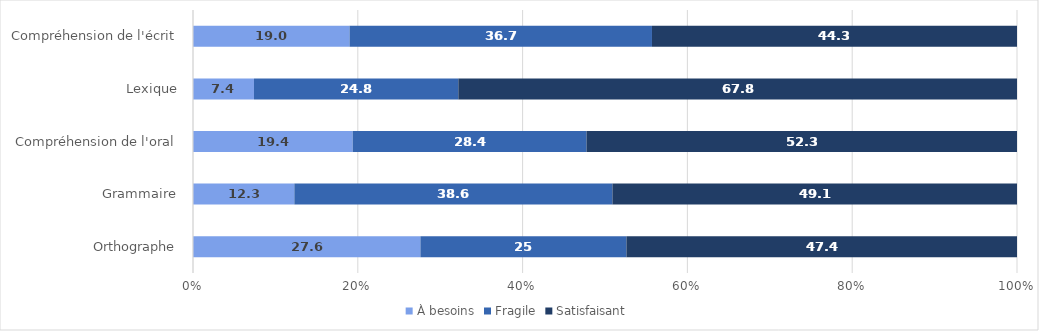
| Category | À besoins | Fragile | Satisfaisant |
|---|---|---|---|
| Compréhension de l'écrit | 19 | 36.7 | 44.3 |
| Lexique | 7.4 | 24.8 | 67.8 |
| Compréhension de l'oral | 19.4 | 28.4 | 52.3 |
| Grammaire | 12.3 | 38.6 | 49.1 |
| Orthographe | 27.6 | 25 | 47.4 |